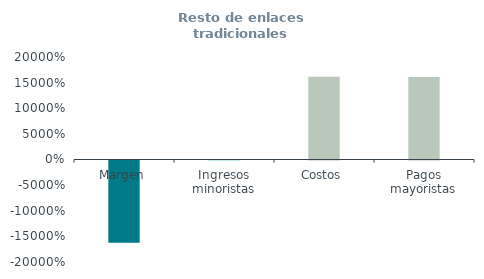
| Category | Resto de enlaces tradicionales
(% ingresos) |
|---|---|
| Margen | -160.335 |
| Ingresos minoristas | 1 |
| Costos | 161.335 |
| Pagos mayoristas | 161.215 |